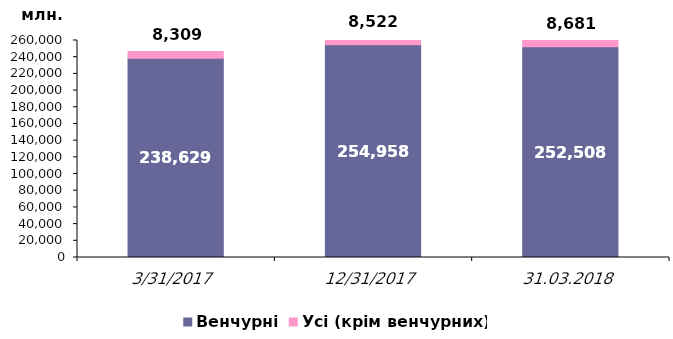
| Category | Венчурні | Усі (крім венчурних) |
|---|---|---|
| 31.03.2017 | 238628.798 | 8309.226 |
| 31.12.2017 | 254957.863 | 8521.52 |
| 31.03.2018 | 252508.217 | 8680.52 |